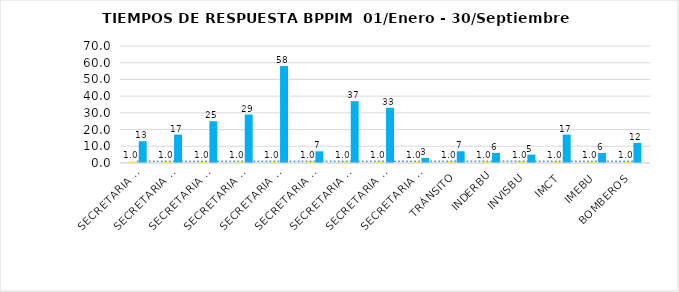
| Category | PROMEDIO DIAS HÁBILES | N. PROYECTOS |
|---|---|---|
| SECRETARIA ADMINISTRATIVA | 1 | 13 |
| SECRETARIA DESARROLLO SOCIAL | 1 | 17 |
| SECRETARIA DE EDUCACIÓN | 1 | 25 |
| SECRETARIA DE HACIENDA | 1 | 29 |
| SECRETARIA DE INFRAESTRUCTURA | 1 | 58 |
| SECRETARIA DE PLANEACION | 1 | 7 |
| SECRETARIA DE SALUD Y AMBIENTE | 1 | 37 |
| SECRETARIA DEL INTERIOR | 1 | 33 |
| SECRETARIA JURIDICA | 1 | 3 |
| TRÁNSITO | 1 | 7 |
| INDERBU | 1 | 6 |
| INVISBU | 1 | 5 |
| IMCT | 1 | 17 |
| IMEBU | 1 | 6 |
| BOMBEROS  | 1 | 12 |